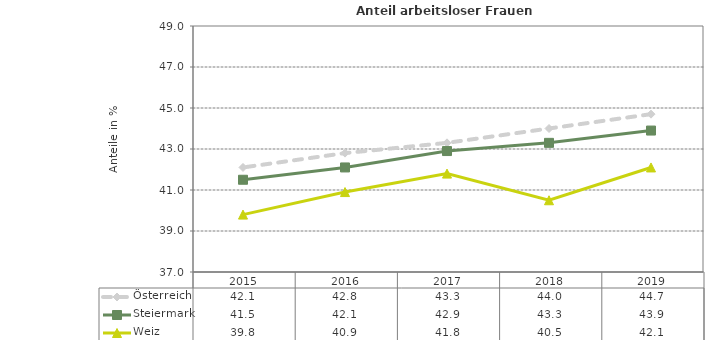
| Category | Österreich | Steiermark | Weiz |
|---|---|---|---|
| 2019.0 | 44.7 | 43.9 | 42.1 |
| 2018.0 | 44 | 43.3 | 40.5 |
| 2017.0 | 43.3 | 42.9 | 41.8 |
| 2016.0 | 42.8 | 42.1 | 40.9 |
| 2015.0 | 42.1 | 41.5 | 39.8 |